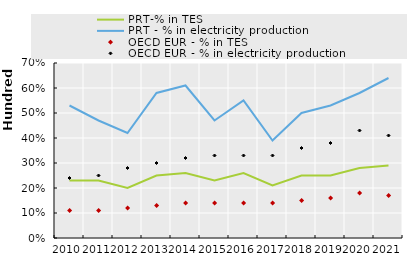
| Category | PRT-% in TES | PRT - % in electricity production | OECD EUR - % in TES | OECD EUR - % in electricity production |
|---|---|---|---|---|
| 0 | 23 | 53 | 11 | 24 |
| 1 | 23 | 47 | 11 | 25 |
| 2 | 20 | 42 | 12 | 28 |
| 3 | 25 | 58 | 13 | 30 |
| 4 | 26 | 61 | 14 | 32 |
| 5 | 23 | 47 | 14 | 33 |
| 6 | 26 | 55 | 14 | 33 |
| 7 | 21 | 39 | 14 | 33 |
| 8 | 25 | 50 | 15 | 36 |
| 9 | 25 | 53 | 16 | 38 |
| 10 | 28 | 58 | 18 | 43 |
| 11 | 29 | 64 | 17 | 41 |